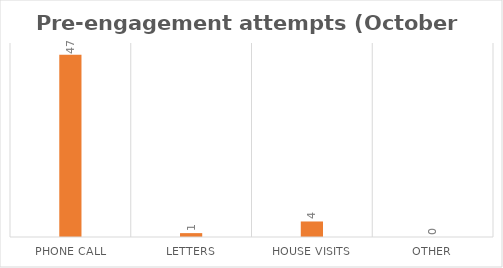
| Category | Series 0 |
|---|---|
| Phone call | 47 |
| Letters | 1 |
| House Visits | 4 |
| Other | 0 |